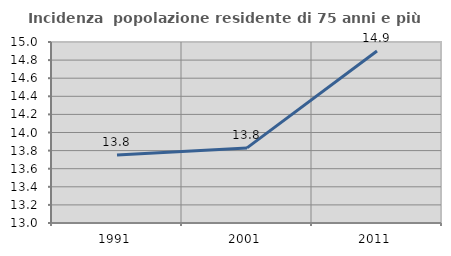
| Category | Incidenza  popolazione residente di 75 anni e più |
|---|---|
| 1991.0 | 13.751 |
| 2001.0 | 13.83 |
| 2011.0 | 14.901 |